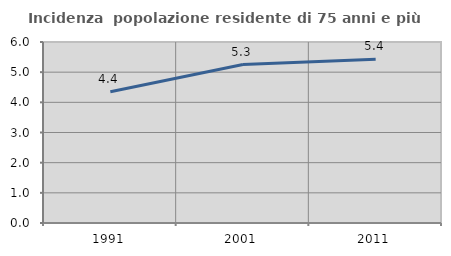
| Category | Incidenza  popolazione residente di 75 anni e più |
|---|---|
| 1991.0 | 4.352 |
| 2001.0 | 5.254 |
| 2011.0 | 5.431 |